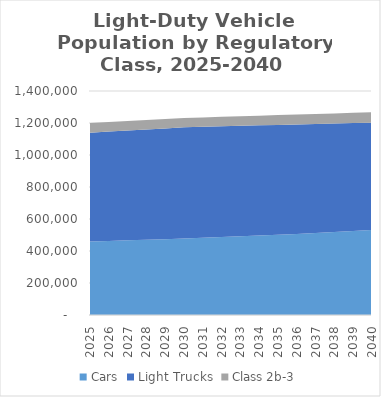
| Category | Cars | Light Trucks | Class 2b-3 |
|---|---|---|---|
| 2025.0 | 459068.604 | 680571.078 | 59953.681 |
| 2026.0 | 462740 | 683570 | 59620 |
| 2027.0 | 466410 | 686560 | 59290 |
| 2028.0 | 470080 | 689560 | 58950 |
| 2029.0 | 473750 | 692560 | 58620 |
| 2030.0 | 477419.171 | 695554.425 | 58282.67 |
| 2031.0 | 482140 | 693880 | 58930 |
| 2032.0 | 486860 | 692210 | 59570 |
| 2033.0 | 491580 | 690530 | 60210 |
| 2034.0 | 496300 | 688860 | 60850 |
| 2035.0 | 501017.31 | 687185.462 | 61497.209 |
| 2036.0 | 506980 | 684010 | 62120 |
| 2037.0 | 512930 | 680840 | 62750 |
| 2038.0 | 518890 | 677670 | 63380 |
| 2039.0 | 524850 | 674500 | 64000 |
| 2040.0 | 530810.468 | 671325.974 | 64628.69 |